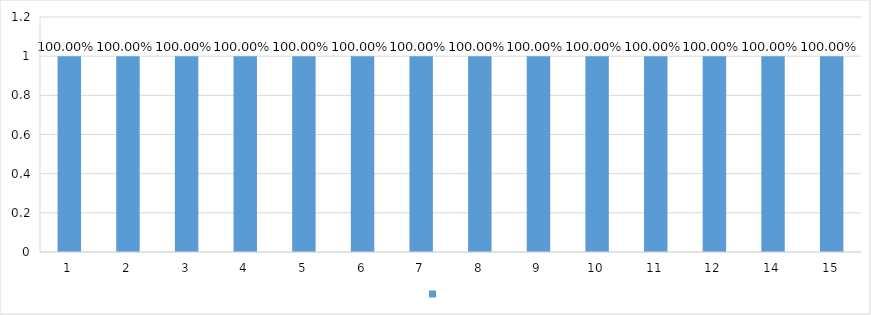
| Category | Series 0 |
|---|---|
| 1 | 1 |
| 2 | 1 |
| 3 | 1 |
| 4 | 1 |
| 5 | 1 |
| 6 | 1 |
| 7 | 1 |
| 8 | 1 |
| 9 | 1 |
| 10 | 1 |
| 11 | 1 |
| 12 | 1 |
| 14 | 1 |
| 15 | 1 |